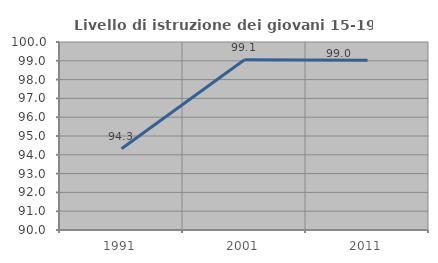
| Category | Livello di istruzione dei giovani 15-19 anni |
|---|---|
| 1991.0 | 94.321 |
| 2001.0 | 99.052 |
| 2011.0 | 99.024 |